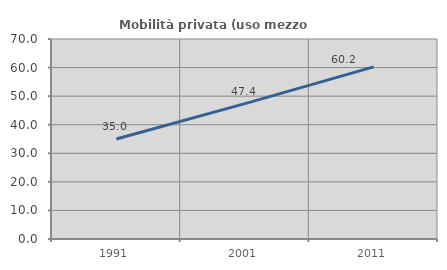
| Category | Mobilità privata (uso mezzo privato) |
|---|---|
| 1991.0 | 35.019 |
| 2001.0 | 47.399 |
| 2011.0 | 60.244 |